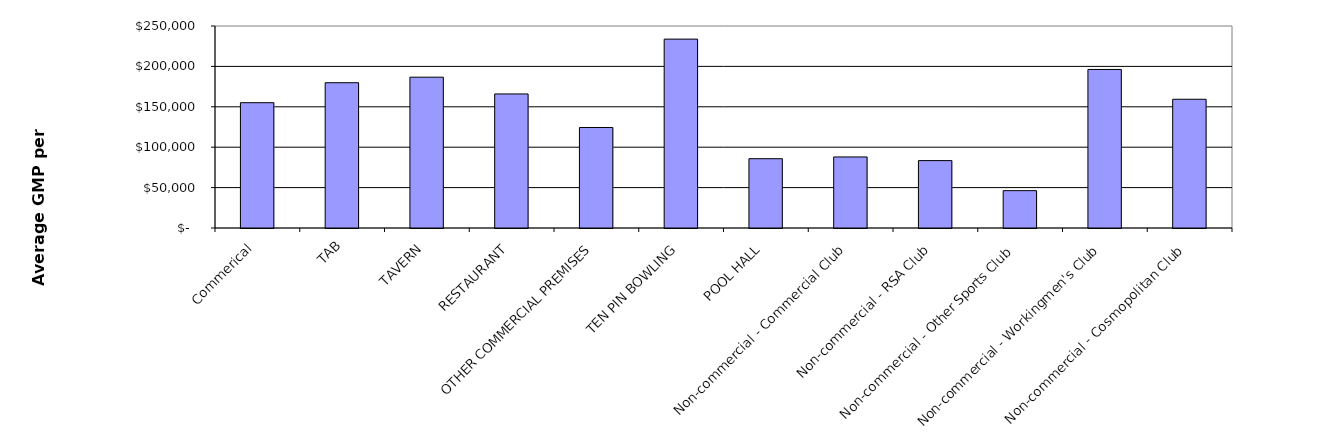
| Category | Series 0 |
|---|---|
| Commerical | 155088.63 |
| TAB | 179805.875 |
| TAVERN | 186662.575 |
| RESTAURANT | 165901.735 |
| OTHER COMMERCIAL PREMISES | 124386.278 |
| TEN PIN BOWLING | 233761.043 |
| POOL HALL | 85780.287 |
| Non-commercial - Commercial Club | 87945.194 |
| Non-commercial - RSA Club | 83416.745 |
| Non-commercial - Other Sports Club | 46234.72 |
| Non-commercial - Workingmen's Club | 196211.969 |
| Non-commercial - Cosmopolitan Club | 159338.005 |